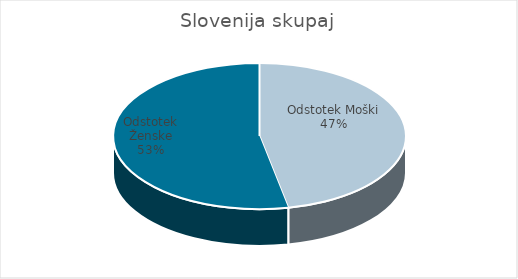
| Category | Slovenija skupaj |
|---|---|
| Odstotek Moški | 21.63 |
| Odstotek Ženske | 24.53 |